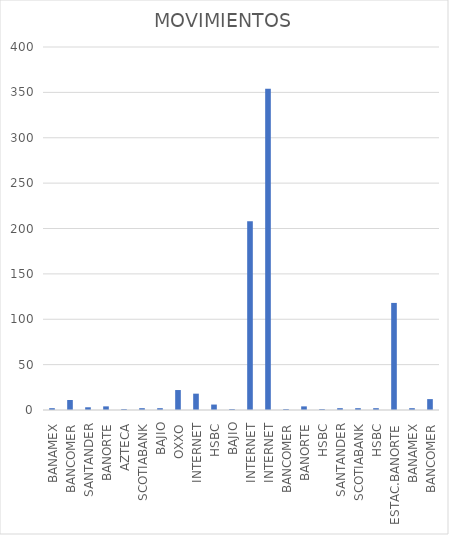
| Category | MOVIMIENTOS |
|---|---|
| BANAMEX | 2 |
| BANCOMER | 11 |
| SANTANDER | 3 |
| BANORTE | 4 |
| AZTECA | 1 |
| SCOTIABANK | 2 |
| BAJIO | 2 |
| OXXO | 22 |
| INTERNET | 18 |
| HSBC | 6 |
| BAJIO | 1 |
| INTERNET | 208 |
| INTERNET | 354 |
| BANCOMER | 1 |
| BANORTE | 4 |
| HSBC | 1 |
| SANTANDER | 2 |
| SCOTIABANK | 2 |
| HSBC | 2 |
| ESTAC.BANORTE | 118 |
| BANAMEX | 2 |
| BANCOMER | 12 |